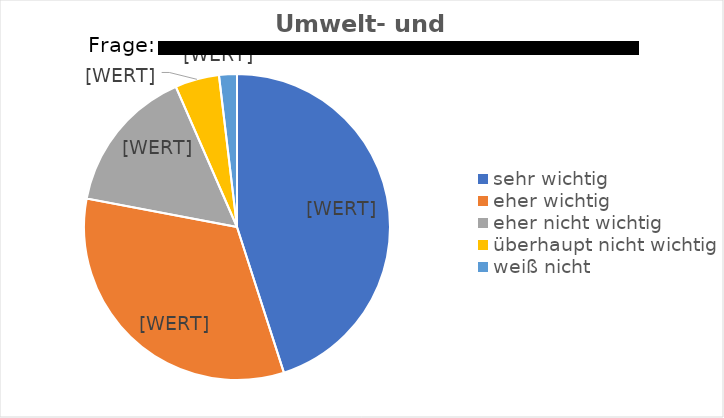
| Category | Series 0 |
|---|---|
| sehr wichtig | 454 |
| eher wichtig | 332 |
| eher nicht wichtig | 156 |
| überhaupt nicht wichtig | 47 |
| weiß nicht | 19 |